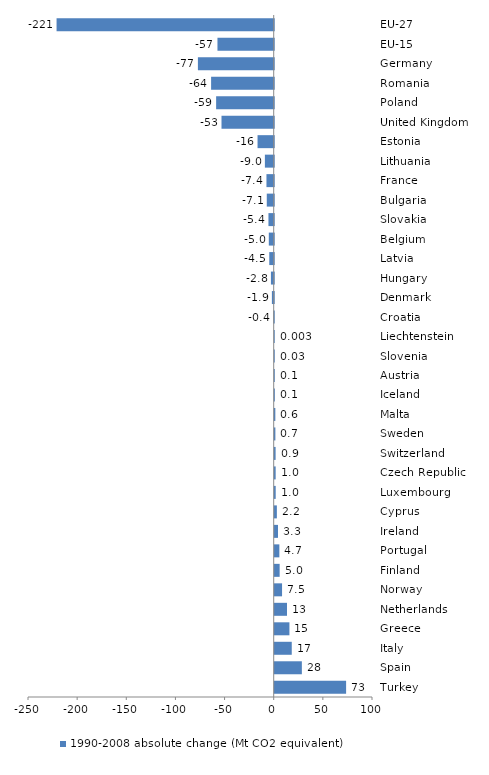
| Category | 1990-2008 absolute change (Mt CO2 equivalent) |
|---|---|
| EU-27 | -220.938 |
| EU-15 | -57.232 |
| Germany | -77.133 |
| Romania | -63.702 |
| Poland | -58.59 |
| United Kingdom | -53.123 |
| Estonia | -16.453 |
| Lithuania | -8.982 |
| France | -7.389 |
| Bulgaria | -7.064 |
| Slovakia | -5.354 |
| Belgium | -4.985 |
| Latvia | -4.522 |
| Hungary | -2.847 |
| Denmark | -1.858 |
| Croatia | -0.419 |
| Liechtenstein | 0.003 |
| Slovenia | 0.03 |
| Austria | 0.071 |
| Iceland | 0.12 |
| Malta | 0.628 |
| Sweden | 0.675 |
| Switzerland | 0.904 |
| Czech Republic | 0.96 |
| Luxembourg | 1.001 |
| Cyprus | 2.19 |
| Ireland | 3.322 |
| Portugal | 4.726 |
| Finland | 5.022 |
| Norway | 7.469 |
| Netherlands | 12.521 |
| Greece | 14.966 |
| Italy | 17.333 |
| Spain | 27.619 |
| Turkey | 72.636 |